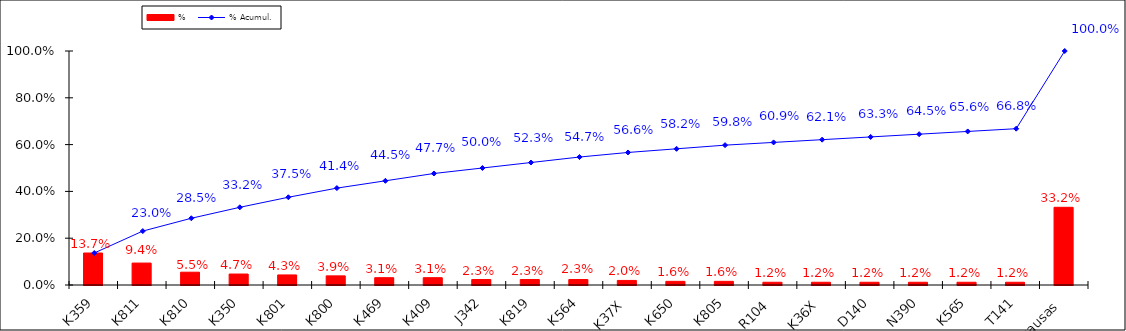
| Category | % |
|---|---|
| K359 | 0.137 |
| K811 | 0.094 |
| K810 | 0.055 |
| K350 | 0.047 |
| K801 | 0.043 |
| K800 | 0.039 |
| K469 | 0.031 |
| K409 | 0.031 |
| J342 | 0.023 |
| K819 | 0.023 |
| K564 | 0.023 |
| K37X | 0.02 |
| K650 | 0.016 |
| K805 | 0.016 |
| R104 | 0.012 |
| K36X | 0.012 |
| D140 | 0.012 |
| N390 | 0.012 |
| K565 | 0.012 |
| T141 | 0.012 |
| Otras causas | 0.332 |